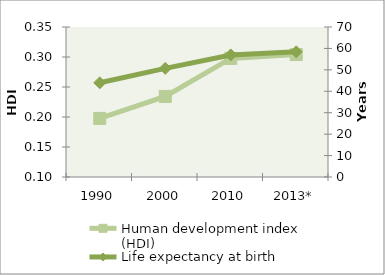
| Category | Human development index (HDI) |
|---|---|
| 1990 | 0.198 |
| 2000 | 0.234 |
| 2010 | 0.298 |
| 2013* | 0.304 |